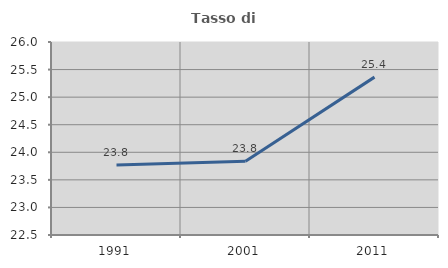
| Category | Tasso di occupazione   |
|---|---|
| 1991.0 | 23.771 |
| 2001.0 | 23.837 |
| 2011.0 | 25.363 |